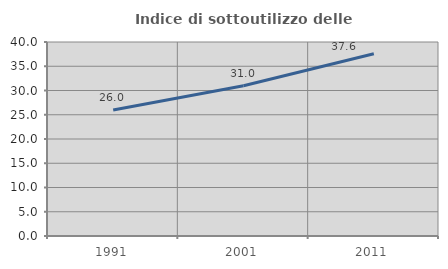
| Category | Indice di sottoutilizzo delle abitazioni  |
|---|---|
| 1991.0 | 25.997 |
| 2001.0 | 30.973 |
| 2011.0 | 37.571 |